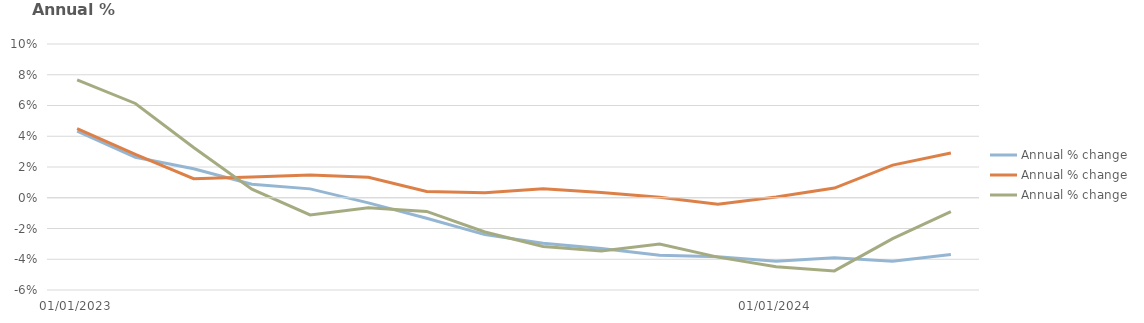
| Category | England | Scotland | Wales |
|---|---|---|---|
| 01/01/2023 | 0.043 | 0.045 | 0.077 |
| 01/02/2023 | 0.026 | 0.028 | 0.061 |
| 01/03/2023 | 0.019 | 0.012 | 0.033 |
| 01/04/2023 | 0.009 | 0.013 | 0.006 |
| 01/05/2023 | 0.006 | 0.015 | -0.011 |
| 01/06/2023 | -0.003 | 0.013 | -0.007 |
| 01/07/2023 | -0.013 | 0.004 | -0.009 |
| 01/08/2023 | -0.024 | 0.003 | -0.022 |
| 01/09/2023 | -0.03 | 0.006 | -0.032 |
| 01/10/2023 | -0.033 | 0.003 | -0.035 |
| 01/11/2023 | -0.037 | 0 | -0.03 |
| 01/12/2023 | -0.038 | -0.004 | -0.039 |
| 01/01/2024 | -0.041 | 0 | -0.045 |
| 01/02/2024 | -0.039 | 0.006 | -0.048 |
| 01/03/2024 | -0.041 | 0.021 | -0.027 |
| 01/04/2024 | -0.037 | 0.029 | -0.009 |